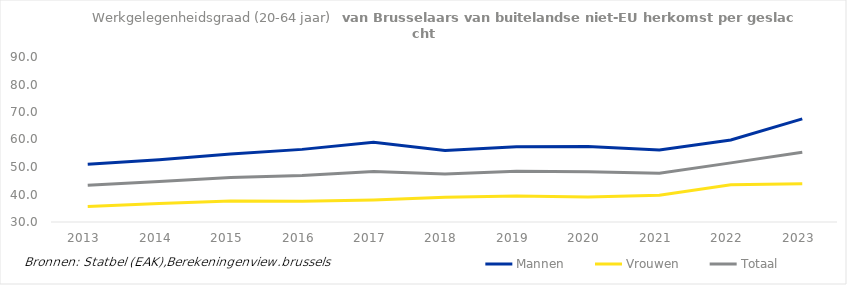
| Category | Mannen | Vrouwen | Totaal |
|---|---|---|---|
| 2013.0 | 51.026 | 35.624 | 43.365 |
| 2014.0 | 52.623 | 36.688 | 44.724 |
| 2015.0 | 54.768 | 37.594 | 46.169 |
| 2016.0 | 56.409 | 37.505 | 46.943 |
| 2017.0 | 58.987 | 38.029 | 48.384 |
| 2018.0 | 55.973 | 39.023 | 47.469 |
| 2019.0 | 57.372 | 39.487 | 48.447 |
| 2020.0 | 57.458 | 39.116 | 48.265 |
| 2021.0 | 56.223 | 39.739 | 47.734 |
| 2022.0 | 59.81 | 43.559 | 51.495 |
| 2023.0 | 67.521 | 43.915 | 55.374 |